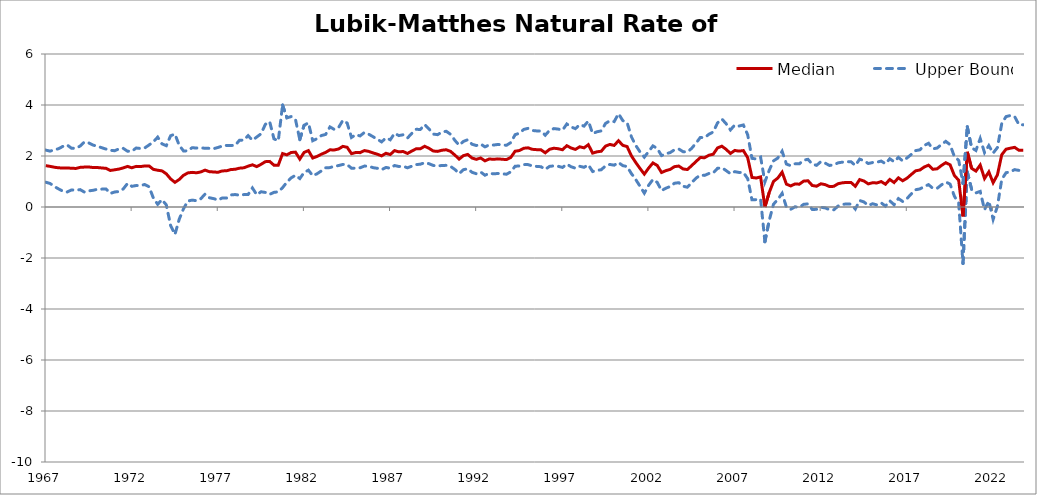
| Category | Lower Bound | Median | Upper Bound |
|---|---|---|---|
| 1967-01-01 | 0.972 | 1.623 | 2.232 |
| 1967-04-01 | 0.924 | 1.594 | 2.191 |
| 1967-07-01 | 0.804 | 1.559 | 2.242 |
| 1967-10-01 | 0.708 | 1.537 | 2.287 |
| 1968-01-01 | 0.619 | 1.528 | 2.378 |
| 1968-04-01 | 0.59 | 1.532 | 2.43 |
| 1968-07-01 | 0.671 | 1.519 | 2.303 |
| 1968-10-01 | 0.659 | 1.513 | 2.301 |
| 1969-01-01 | 0.681 | 1.554 | 2.392 |
| 1969-04-01 | 0.583 | 1.565 | 2.551 |
| 1969-07-01 | 0.633 | 1.569 | 2.513 |
| 1969-10-01 | 0.655 | 1.548 | 2.427 |
| 1970-01-01 | 0.695 | 1.548 | 2.383 |
| 1970-04-01 | 0.7 | 1.532 | 2.326 |
| 1970-07-01 | 0.708 | 1.516 | 2.271 |
| 1970-10-01 | 0.532 | 1.433 | 2.227 |
| 1971-01-01 | 0.589 | 1.459 | 2.206 |
| 1971-04-01 | 0.606 | 1.487 | 2.278 |
| 1971-07-01 | 0.707 | 1.533 | 2.3 |
| 1971-10-01 | 0.924 | 1.592 | 2.188 |
| 1972-01-01 | 0.811 | 1.537 | 2.187 |
| 1972-04-01 | 0.842 | 1.593 | 2.314 |
| 1972-07-01 | 0.842 | 1.585 | 2.293 |
| 1972-10-01 | 0.882 | 1.609 | 2.316 |
| 1973-01-01 | 0.792 | 1.61 | 2.433 |
| 1973-04-01 | 0.35 | 1.477 | 2.555 |
| 1973-07-01 | 0.105 | 1.442 | 2.74 |
| 1973-10-01 | 0.289 | 1.416 | 2.476 |
| 1974-01-01 | 0.083 | 1.302 | 2.404 |
| 1974-04-01 | -0.725 | 1.103 | 2.794 |
| 1974-07-01 | -1.078 | 0.968 | 2.861 |
| 1974-10-01 | -0.48 | 1.079 | 2.418 |
| 1975-01-01 | -0.067 | 1.241 | 2.199 |
| 1975-04-01 | 0.233 | 1.337 | 2.202 |
| 1975-07-01 | 0.27 | 1.358 | 2.326 |
| 1975-10-01 | 0.247 | 1.342 | 2.312 |
| 1976-01-01 | 0.321 | 1.375 | 2.323 |
| 1976-04-01 | 0.508 | 1.446 | 2.302 |
| 1976-07-01 | 0.363 | 1.385 | 2.3 |
| 1976-10-01 | 0.328 | 1.374 | 2.286 |
| 1977-01-01 | 0.271 | 1.362 | 2.335 |
| 1977-04-01 | 0.354 | 1.415 | 2.391 |
| 1977-07-01 | 0.352 | 1.42 | 2.415 |
| 1977-10-01 | 0.473 | 1.469 | 2.414 |
| 1978-01-01 | 0.489 | 1.48 | 2.416 |
| 1978-04-01 | 0.462 | 1.523 | 2.62 |
| 1978-07-01 | 0.486 | 1.537 | 2.623 |
| 1978-10-01 | 0.492 | 1.601 | 2.798 |
| 1979-01-01 | 0.746 | 1.655 | 2.618 |
| 1979-04-01 | 0.48 | 1.584 | 2.745 |
| 1979-07-01 | 0.598 | 1.673 | 2.87 |
| 1979-10-01 | 0.571 | 1.778 | 3.241 |
| 1980-01-01 | 0.496 | 1.788 | 3.348 |
| 1980-04-01 | 0.573 | 1.639 | 2.674 |
| 1980-07-01 | 0.596 | 1.638 | 2.593 |
| 1980-10-01 | 0.76 | 2.095 | 3.999 |
| 1981-01-01 | 0.97 | 2.045 | 3.497 |
| 1981-04-01 | 1.142 | 2.138 | 3.546 |
| 1981-07-01 | 1.244 | 2.151 | 3.428 |
| 1981-10-01 | 1.115 | 1.88 | 2.641 |
| 1982-01-01 | 1.354 | 2.141 | 3.203 |
| 1982-04-01 | 1.444 | 2.212 | 3.3 |
| 1982-07-01 | 1.227 | 1.92 | 2.599 |
| 1982-10-01 | 1.303 | 1.982 | 2.678 |
| 1983-01-01 | 1.413 | 2.07 | 2.801 |
| 1983-04-01 | 1.538 | 2.141 | 2.845 |
| 1983-07-01 | 1.545 | 2.242 | 3.14 |
| 1983-10-01 | 1.601 | 2.236 | 3.044 |
| 1984-01-01 | 1.624 | 2.275 | 3.116 |
| 1984-04-01 | 1.669 | 2.378 | 3.4 |
| 1984-07-01 | 1.661 | 2.341 | 3.291 |
| 1984-10-01 | 1.522 | 2.092 | 2.726 |
| 1985-01-01 | 1.519 | 2.138 | 2.837 |
| 1985-04-01 | 1.537 | 2.132 | 2.787 |
| 1985-07-01 | 1.604 | 2.213 | 2.924 |
| 1985-10-01 | 1.6 | 2.18 | 2.855 |
| 1986-01-01 | 1.542 | 2.122 | 2.758 |
| 1986-04-01 | 1.518 | 2.07 | 2.655 |
| 1986-07-01 | 1.463 | 2.005 | 2.553 |
| 1986-10-01 | 1.552 | 2.107 | 2.709 |
| 1987-01-01 | 1.52 | 2.058 | 2.634 |
| 1987-04-01 | 1.627 | 2.211 | 2.89 |
| 1987-07-01 | 1.589 | 2.162 | 2.801 |
| 1987-10-01 | 1.598 | 2.177 | 2.832 |
| 1988-01-01 | 1.537 | 2.1 | 2.705 |
| 1988-04-01 | 1.601 | 2.194 | 2.884 |
| 1988-07-01 | 1.663 | 2.281 | 3.046 |
| 1988-10-01 | 1.678 | 2.285 | 3.041 |
| 1989-01-01 | 1.738 | 2.382 | 3.231 |
| 1989-04-01 | 1.698 | 2.301 | 3.063 |
| 1989-07-01 | 1.629 | 2.196 | 2.86 |
| 1989-10-01 | 1.609 | 2.181 | 2.837 |
| 1990-01-01 | 1.628 | 2.226 | 2.937 |
| 1990-04-01 | 1.633 | 2.245 | 2.97 |
| 1990-07-01 | 1.593 | 2.182 | 2.851 |
| 1990-10-01 | 1.473 | 2.038 | 2.615 |
| 1991-01-01 | 1.309 | 1.879 | 2.423 |
| 1991-04-01 | 1.463 | 2.014 | 2.572 |
| 1991-07-01 | 1.499 | 2.061 | 2.639 |
| 1991-10-01 | 1.36 | 1.919 | 2.461 |
| 1992-01-01 | 1.305 | 1.869 | 2.41 |
| 1992-04-01 | 1.371 | 1.923 | 2.469 |
| 1992-07-01 | 1.246 | 1.81 | 2.357 |
| 1992-10-01 | 1.323 | 1.884 | 2.438 |
| 1993-01-01 | 1.3 | 1.87 | 2.43 |
| 1993-04-01 | 1.314 | 1.887 | 2.453 |
| 1993-07-01 | 1.3 | 1.872 | 2.435 |
| 1993-10-01 | 1.286 | 1.859 | 2.421 |
| 1994-01-01 | 1.379 | 1.945 | 2.526 |
| 1994-04-01 | 1.598 | 2.188 | 2.837 |
| 1994-07-01 | 1.609 | 2.214 | 2.892 |
| 1994-10-01 | 1.665 | 2.304 | 3.041 |
| 1995-01-01 | 1.662 | 2.32 | 3.084 |
| 1995-04-01 | 1.609 | 2.263 | 3 |
| 1995-07-01 | 1.592 | 2.249 | 2.984 |
| 1995-10-01 | 1.58 | 2.243 | 2.98 |
| 1996-01-01 | 1.474 | 2.126 | 2.816 |
| 1996-04-01 | 1.594 | 2.263 | 3.006 |
| 1996-07-01 | 1.612 | 2.305 | 3.075 |
| 1996-10-01 | 1.597 | 2.285 | 3.056 |
| 1997-01-01 | 1.551 | 2.246 | 3.013 |
| 1997-04-01 | 1.682 | 2.405 | 3.255 |
| 1997-07-01 | 1.579 | 2.314 | 3.14 |
| 1997-10-01 | 1.521 | 2.259 | 3.072 |
| 1998-01-01 | 1.597 | 2.362 | 3.23 |
| 1998-04-01 | 1.556 | 2.319 | 3.172 |
| 1998-07-01 | 1.655 | 2.443 | 3.372 |
| 1998-10-01 | 1.391 | 2.113 | 2.878 |
| 1999-01-01 | 1.436 | 2.164 | 2.95 |
| 1999-04-01 | 1.462 | 2.187 | 2.983 |
| 1999-07-01 | 1.615 | 2.388 | 3.279 |
| 1999-10-01 | 1.668 | 2.454 | 3.378 |
| 2000-01-01 | 1.64 | 2.414 | 3.348 |
| 2000-04-01 | 1.747 | 2.599 | 3.659 |
| 2000-07-01 | 1.621 | 2.419 | 3.388 |
| 2000-10-01 | 1.587 | 2.37 | 3.311 |
| 2001-01-01 | 1.311 | 2.008 | 2.754 |
| 2001-04-01 | 1.08 | 1.747 | 2.416 |
| 2001-07-01 | 0.814 | 1.511 | 2.163 |
| 2001-10-01 | 0.543 | 1.29 | 1.954 |
| 2002-01-01 | 0.852 | 1.525 | 2.176 |
| 2002-04-01 | 1.078 | 1.728 | 2.397 |
| 2002-07-01 | 0.966 | 1.628 | 2.297 |
| 2002-10-01 | 0.643 | 1.353 | 2.017 |
| 2003-01-01 | 0.737 | 1.425 | 2.087 |
| 2003-04-01 | 0.804 | 1.475 | 2.134 |
| 2003-07-01 | 0.932 | 1.583 | 2.242 |
| 2003-10-01 | 0.954 | 1.606 | 2.275 |
| 2004-01-01 | 0.813 | 1.493 | 2.169 |
| 2004-04-01 | 0.776 | 1.469 | 2.154 |
| 2004-07-01 | 0.959 | 1.623 | 2.302 |
| 2004-10-01 | 1.13 | 1.784 | 2.503 |
| 2005-01-01 | 1.25 | 1.938 | 2.726 |
| 2005-04-01 | 1.24 | 1.934 | 2.719 |
| 2005-07-01 | 1.314 | 2.03 | 2.852 |
| 2005-10-01 | 1.334 | 2.071 | 2.941 |
| 2006-01-01 | 1.517 | 2.316 | 3.298 |
| 2006-04-01 | 1.541 | 2.385 | 3.451 |
| 2006-07-01 | 1.427 | 2.261 | 3.267 |
| 2006-10-01 | 1.304 | 2.099 | 3.023 |
| 2007-01-01 | 1.387 | 2.218 | 3.215 |
| 2007-04-01 | 1.355 | 2.191 | 3.176 |
| 2007-07-01 | 1.356 | 2.212 | 3.216 |
| 2007-10-01 | 1.114 | 1.935 | 2.837 |
| 2008-01-01 | 0.283 | 1.159 | 1.908 |
| 2008-04-01 | 0.289 | 1.137 | 1.885 |
| 2008-07-01 | 0.31 | 1.181 | 1.958 |
| 2008-10-01 | -1.362 | -0.001 | 0.985 |
| 2009-01-01 | -0.528 | 0.566 | 1.44 |
| 2009-04-01 | 0.11 | 1.004 | 1.808 |
| 2009-07-01 | 0.294 | 1.135 | 1.92 |
| 2009-10-01 | 0.537 | 1.366 | 2.186 |
| 2010-01-01 | -0.009 | 0.895 | 1.684 |
| 2010-04-01 | -0.09 | 0.827 | 1.618 |
| 2010-07-01 | 0.008 | 0.905 | 1.693 |
| 2010-10-01 | -0.013 | 0.894 | 1.693 |
| 2011-01-01 | 0.104 | 1.015 | 1.838 |
| 2011-04-01 | 0.122 | 1.029 | 1.871 |
| 2011-07-01 | -0.096 | 0.844 | 1.68 |
| 2011-10-01 | -0.092 | 0.815 | 1.634 |
| 2012-01-01 | -0.012 | 0.91 | 1.778 |
| 2012-04-01 | -0.035 | 0.877 | 1.719 |
| 2012-07-01 | -0.108 | 0.801 | 1.63 |
| 2012-10-01 | -0.111 | 0.811 | 1.651 |
| 2013-01-01 | 0.038 | 0.914 | 1.732 |
| 2013-04-01 | 0.103 | 0.948 | 1.759 |
| 2013-07-01 | 0.121 | 0.965 | 1.777 |
| 2013-10-01 | 0.113 | 0.962 | 1.776 |
| 2014-01-01 | -0.082 | 0.812 | 1.628 |
| 2014-04-01 | 0.254 | 1.075 | 1.877 |
| 2014-07-01 | 0.197 | 1.02 | 1.815 |
| 2014-10-01 | 0.061 | 0.906 | 1.706 |
| 2015-01-01 | 0.127 | 0.951 | 1.743 |
| 2015-04-01 | 0.083 | 0.943 | 1.757 |
| 2015-07-01 | 0.163 | 0.997 | 1.801 |
| 2015-10-01 | 0.033 | 0.894 | 1.698 |
| 2016-01-01 | 0.244 | 1.08 | 1.892 |
| 2016-04-01 | 0.088 | 0.96 | 1.777 |
| 2016-07-01 | 0.331 | 1.143 | 1.946 |
| 2016-10-01 | 0.216 | 1.028 | 1.806 |
| 2017-01-01 | 0.332 | 1.13 | 1.924 |
| 2017-04-01 | 0.515 | 1.276 | 2.062 |
| 2017-07-01 | 0.677 | 1.418 | 2.21 |
| 2017-10-01 | 0.709 | 1.451 | 2.243 |
| 2018-01-01 | 0.805 | 1.569 | 2.415 |
| 2018-04-01 | 0.877 | 1.641 | 2.5 |
| 2018-07-01 | 0.732 | 1.479 | 2.278 |
| 2018-10-01 | 0.733 | 1.498 | 2.312 |
| 2019-01-01 | 0.868 | 1.629 | 2.453 |
| 2019-04-01 | 0.978 | 1.738 | 2.575 |
| 2019-07-01 | 0.9 | 1.656 | 2.444 |
| 2019-10-01 | 0.421 | 1.235 | 1.975 |
| 2020-01-01 | 0.156 | 1.049 | 1.83 |
| 2020-04-01 | -2.214 | -0.368 | 0.923 |
| 2020-07-01 | 1.38 | 2.163 | 3.149 |
| 2020-10-01 | 0.695 | 1.517 | 2.324 |
| 2021-01-01 | 0.553 | 1.409 | 2.217 |
| 2021-04-01 | 0.612 | 1.647 | 2.685 |
| 2021-07-01 | -0.105 | 1.119 | 2.134 |
| 2021-10-01 | 0.234 | 1.376 | 2.409 |
| 2022-01-01 | -0.49 | 0.953 | 2.113 |
| 2022-04-01 | 0.03 | 1.264 | 2.332 |
| 2022-07-01 | 1.084 | 2.05 | 3.273 |
| 2022-10-01 | 1.344 | 2.267 | 3.545 |
| 2023-01-01 | 1.382 | 2.306 | 3.588 |
| 2023-04-01 | 1.465 | 2.339 | 3.543 |
| 2023-07-01 | 1.435 | 2.223 | 3.226 |
| 2023-10-01 | 1.423 | 2.225 | 3.223 |